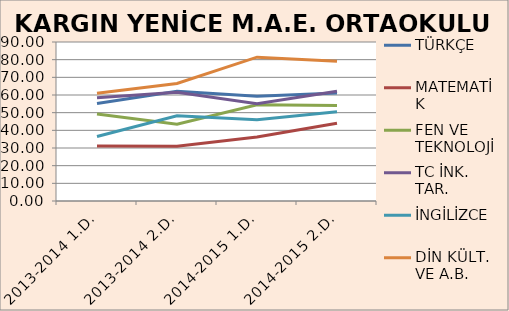
| Category | TÜRKÇE | MATEMATİK | FEN VE TEKNOLOJİ | TC İNK. TAR. | İNGİLİZCE | DİN KÜLT. VE A.B. |
|---|---|---|---|---|---|---|
| 2013-2014 1.D. | 55.19 | 31.2 | 49.19 | 58.46 | 36.54 | 60.96 |
| 2013-2014 2.D. | 62.12 | 30.96 | 43.46 | 61.54 | 48.27 | 66.54 |
| 2014-2015 1.D. | 59.29 | 36.19 | 54.52 | 55 | 45.95 | 81.43 |
| 2014-2015 2.D. | 61.19 | 44.05 | 54.05 | 62.14 | 50.48 | 79.05 |